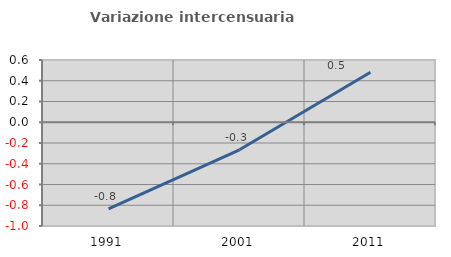
| Category | Variazione intercensuaria annua |
|---|---|
| 1991.0 | -0.834 |
| 2001.0 | -0.265 |
| 2011.0 | 0.483 |